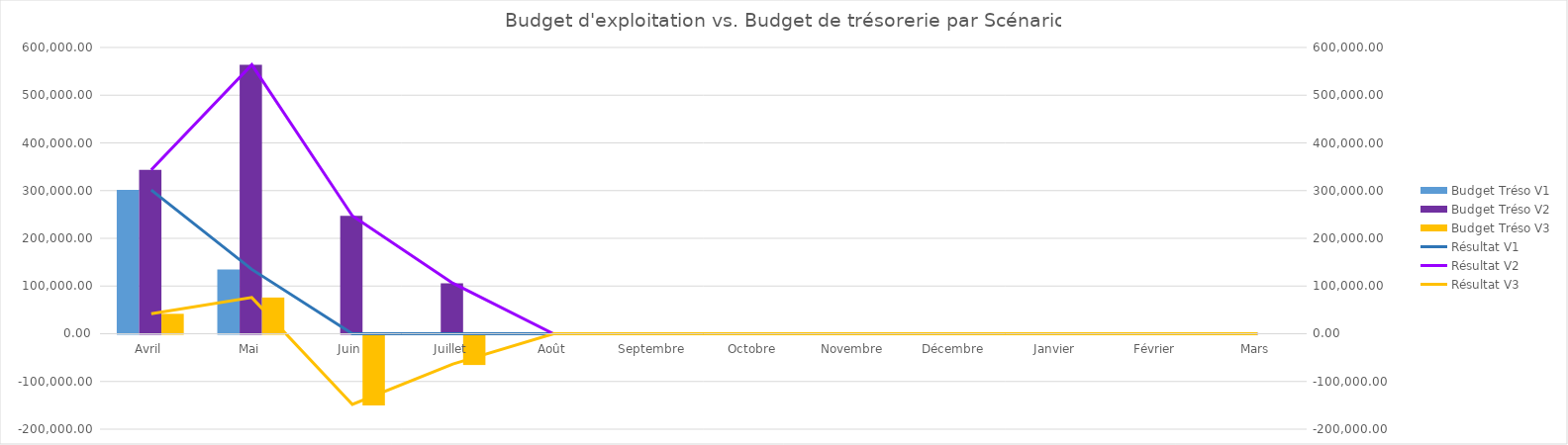
| Category | Budget Tréso V1 | Budget Tréso V2 | Budget Tréso V3 |
|---|---|---|---|
| Avril | 301432.681 | 343568.621 | 41810.193 |
| Mai | 134938.673 | 563815.853 | 75928.706 |
| Juin | 0 | 247092.912 | -147989.286 |
| Juillet | 0 | 105896.576 | -63423.98 |
| Août | 0 | 0 | 0 |
| Septembre | 0 | 0 | 0 |
| Octobre | 0 | 0 | 0 |
| Novembre | 0 | 0 | 0 |
| Décembre | 0 | 0 | 0 |
| Janvier | 0 | 0 | 0 |
| Février | 0 | 0 | 0 |
| Mars | 0 | 0 | 0 |